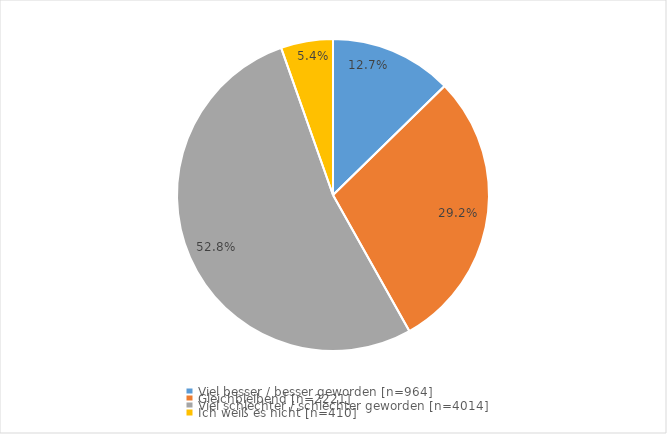
| Category | Series 0 |
|---|---|
| Viel besser / besser geworden [n=964] | 0.127 |
| Gleichbleibend [n=2221] | 0.292 |
| Viel schlechter / schlechter geworden [n=4014] | 0.528 |
| Ich weiß es nicht [n=410] | 0.054 |